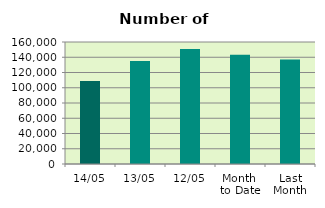
| Category | Series 0 |
|---|---|
| 14/05 | 108826 |
| 13/05 | 134922 |
| 12/05 | 150840 |
| Month 
to Date | 143337.2 |
| Last
Month | 137031.8 |